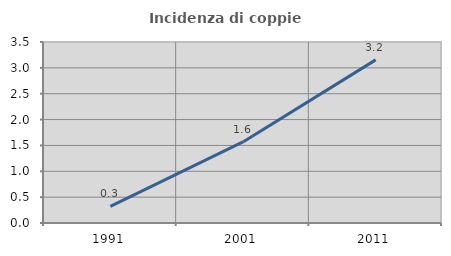
| Category | Incidenza di coppie miste |
|---|---|
| 1991.0 | 0.321 |
| 2001.0 | 1.567 |
| 2011.0 | 3.155 |